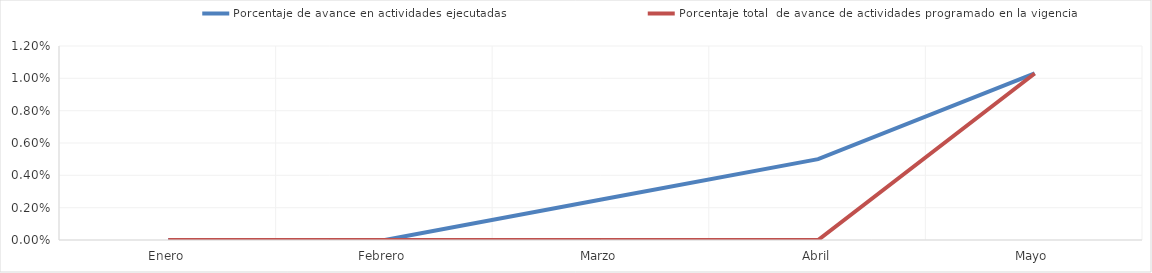
| Category | Porcentaje de avance en actividades ejecutadas | Porcentaje total  de avance de actividades programado en la vigencia |
|---|---|---|
| 0 | 0 | 0 |
| 1 | 0 | 0 |
| 2 | 0.002 | 0 |
| 3 | 0.005 | 0 |
| 4 | 0.01 | 0.01 |